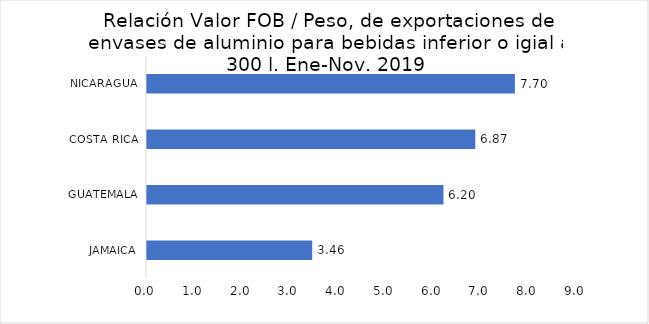
| Category | Series 0 |
|---|---|
| JAMAICA | 3.458 |
| GUATEMALA | 6.205 |
| COSTA RICA | 6.871 |
| NICARAGUA | 7.7 |